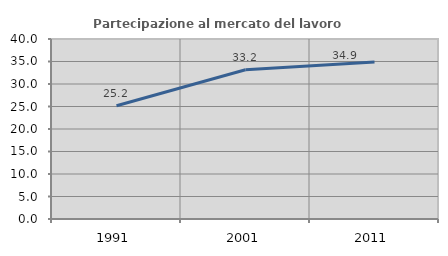
| Category | Partecipazione al mercato del lavoro  femminile |
|---|---|
| 1991.0 | 25.166 |
| 2001.0 | 33.177 |
| 2011.0 | 34.878 |